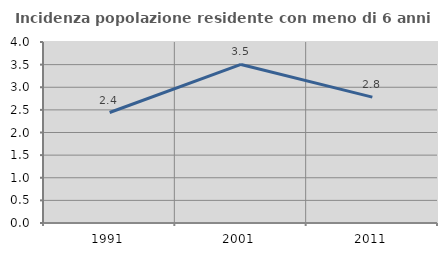
| Category | Incidenza popolazione residente con meno di 6 anni |
|---|---|
| 1991.0 | 2.442 |
| 2001.0 | 3.504 |
| 2011.0 | 2.781 |